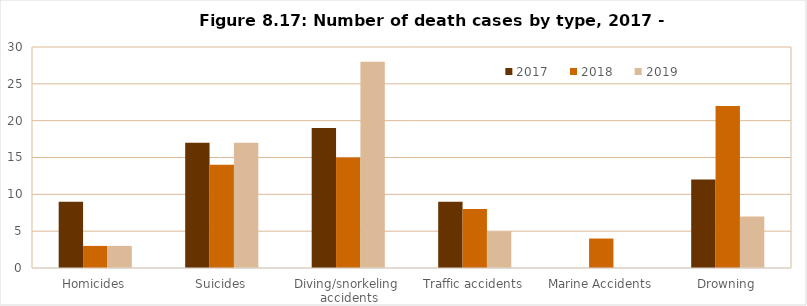
| Category | 2017  | 2018  | 2019  |
|---|---|---|---|
| Homicides | 9 | 3 | 3 |
| Suicides | 17 | 14 | 17 |
| Diving/snorkeling  accidents | 19 | 15 | 28 |
| Traffic accidents | 9 | 8 | 5 |
| Marine Accidents | 0 | 4 | 0 |
| Drowning | 12 | 22 | 7 |